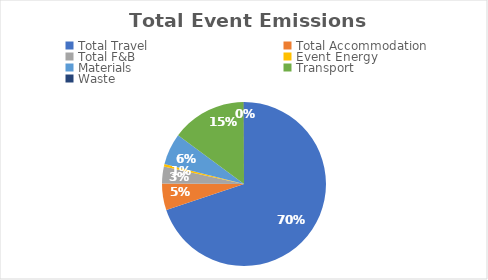
| Category | Series 0 |
|---|---|
| Total Travel | 9.68 |
| Total Accommodation | 0.73 |
| Total F&B | 0.46 |
| Event Energy | 0.07 |
| Materials | 0.86 |
| Transport | 2.05 |
| Waste | 0.01 |